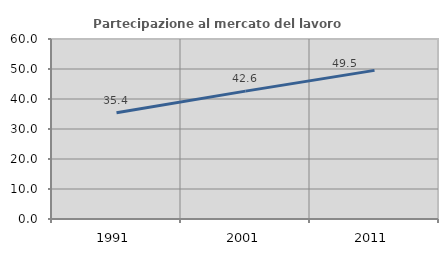
| Category | Partecipazione al mercato del lavoro  femminile |
|---|---|
| 1991.0 | 35.421 |
| 2001.0 | 42.63 |
| 2011.0 | 49.539 |